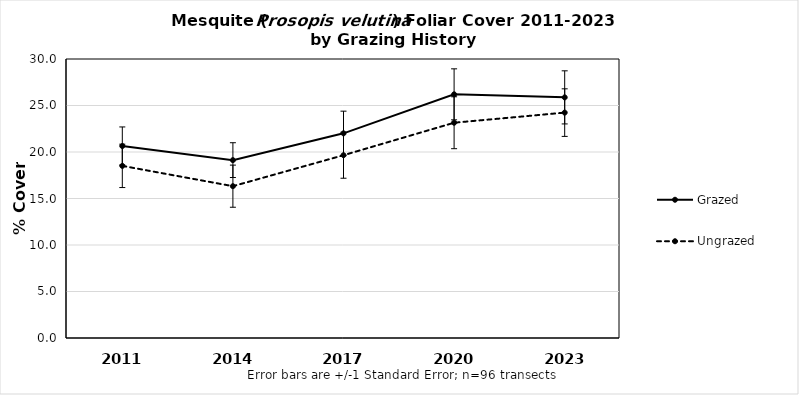
| Category | Grazed | Ungrazed |
|---|---|---|
| 2011.0 | 20.643 | 18.509 |
| 2014.0 | 19.126 | 16.325 |
| 2017.0 | 22.008 | 19.654 |
| 2020.0 | 26.201 | 23.147 |
| 2023.0 | 25.874 | 24.236 |